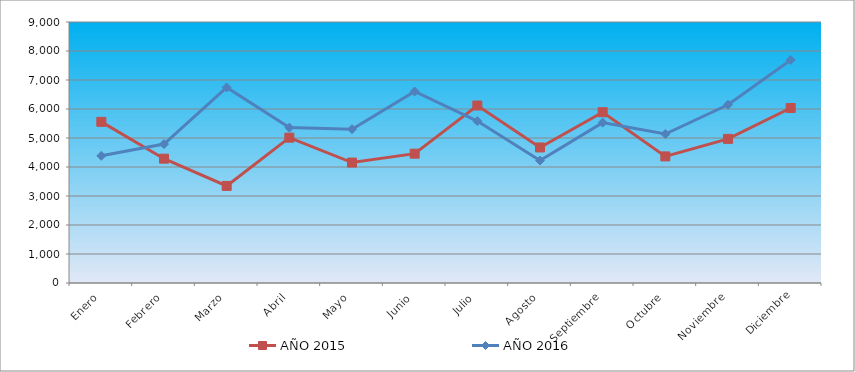
| Category | AÑO 2015 | AÑO 2016 |
|---|---|---|
| Enero | 5557 | 4386 |
| Febrero | 4287 | 4790 |
| Marzo | 3348 | 6743 |
| Abril | 5011 | 5358 |
| Mayo | 4153 | 5303 |
| Junio | 4460 | 6605 |
| Julio | 6120 | 5583 |
| Agosto | 4674 | 4221 |
| Septiembre | 5889 | 5530 |
| Octubre | 4365 | 5136 |
| Noviembre | 4970 | 6147 |
| Diciembre | 6035 | 7691 |